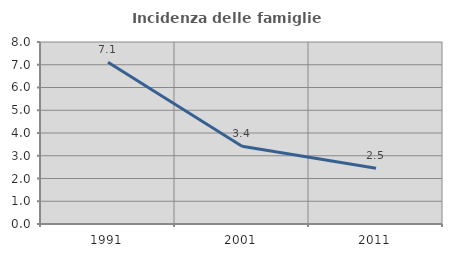
| Category | Incidenza delle famiglie numerose |
|---|---|
| 1991.0 | 7.107 |
| 2001.0 | 3.415 |
| 2011.0 | 2.452 |